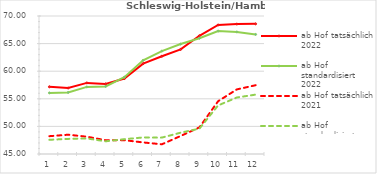
| Category | ab Hof tatsächlich 2022 | ab Hof standardisiert 2022 | ab Hof tatsächlich 2021 | ab Hof standardisiert 2021 |
|---|---|---|---|---|
| 0 | 57.171 | 56.069 | 48.227 | 47.575 |
| 1 | 56.949 | 56.152 | 48.494 | 47.737 |
| 2 | 57.881 | 57.154 | 48.133 | 47.819 |
| 3 | 57.701 | 57.247 | 47.498 | 47.301 |
| 4 | 58.676 | 58.915 | 47.506 | 47.686 |
| 5 | 61.376 | 61.976 | 47.097 | 47.998 |
| 6 | 62.708 | 63.646 | 46.759 | 47.97 |
| 7 | 63.952 | 64.918 | 48.265 | 48.862 |
| 8 | 66.418 | 65.977 | 49.817 | 49.592 |
| 9 | 68.371 | 67.273 | 54.564 | 53.8 |
| 10 | 68.534 | 67.116 | 56.705 | 55.24 |
| 11 | 68.574 | 66.663 | 57.459 | 55.757 |